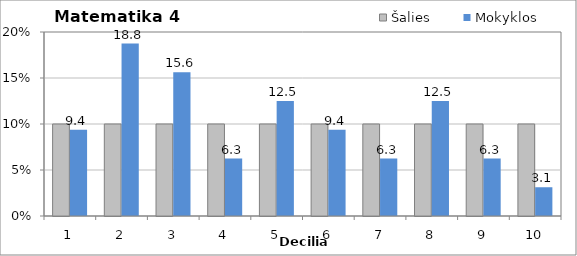
| Category | Šalies | Mokyklos |
|---|---|---|
| 1.0 | 10 | 9.375 |
| 2.0 | 10 | 18.75 |
| 3.0 | 10 | 15.625 |
| 4.0 | 10 | 6.25 |
| 5.0 | 10 | 12.5 |
| 6.0 | 10 | 9.375 |
| 7.0 | 10 | 6.25 |
| 8.0 | 10 | 12.5 |
| 9.0 | 10 | 6.25 |
| 10.0 | 10 | 3.125 |